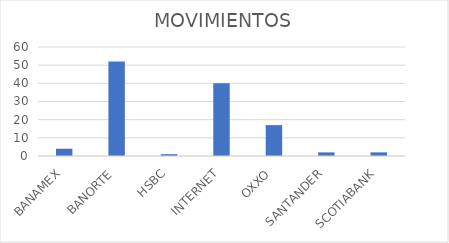
| Category | MOVIMIENTOS |
|---|---|
| BANAMEX | 4 |
| BANORTE | 52 |
| HSBC | 1 |
| INTERNET | 40 |
| OXXO | 17 |
| SANTANDER | 2 |
| SCOTIABANK | 2 |